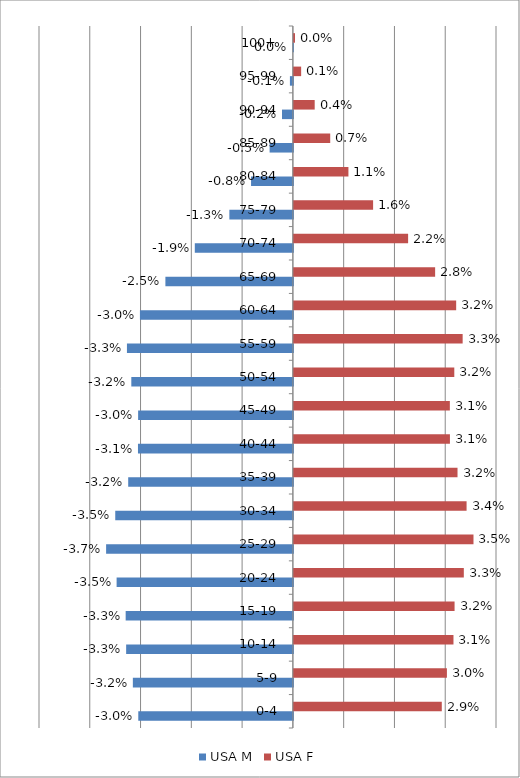
| Category |  USA   M  |  USA   F  |
|---|---|---|
| 0-4 | -0.03 | 0.029 |
| 5-9 | -0.032 | 0.03 |
| 10-14 | -0.033 | 0.031 |
| 15-19 | -0.033 | 0.032 |
| 20-24 | -0.035 | 0.033 |
| 25-29 | -0.037 | 0.035 |
| 30-34 | -0.035 | 0.034 |
| 35-39 | -0.032 | 0.032 |
| 40-44 | -0.031 | 0.031 |
| 45-49 | -0.03 | 0.031 |
| 50-54 | -0.032 | 0.032 |
| 55-59 | -0.033 | 0.033 |
| 60-64 | -0.03 | 0.032 |
| 65-69 | -0.025 | 0.028 |
| 70-74 | -0.019 | 0.022 |
| 75-79 | -0.013 | 0.016 |
| 80-84 | -0.008 | 0.011 |
| 85-89 | -0.005 | 0.007 |
| 90-94 | -0.002 | 0.004 |
| 95-99 | -0.001 | 0.001 |
| 100+ | 0 | 0 |